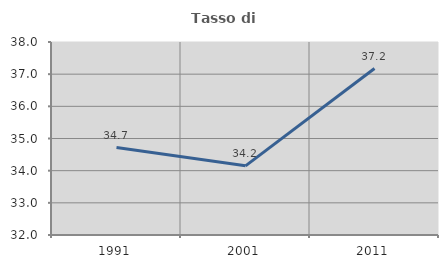
| Category | Tasso di occupazione   |
|---|---|
| 1991.0 | 34.72 |
| 2001.0 | 34.15 |
| 2011.0 | 37.175 |